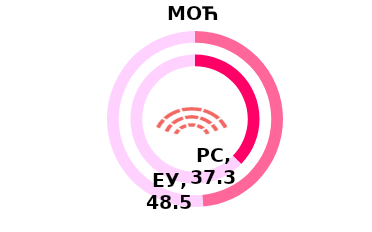
| Category | РС | Series 1 | ЕУ |
|---|---|---|---|
| Index | 37.3 |  | 48.5 |
| Rest | 62.7 |  | 51.5 |